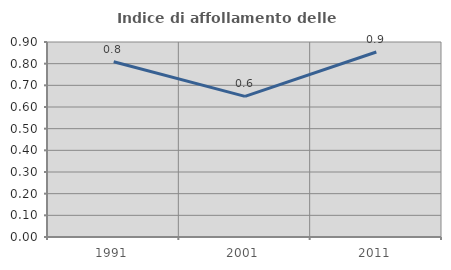
| Category | Indice di affollamento delle abitazioni  |
|---|---|
| 1991.0 | 0.809 |
| 2001.0 | 0.649 |
| 2011.0 | 0.854 |